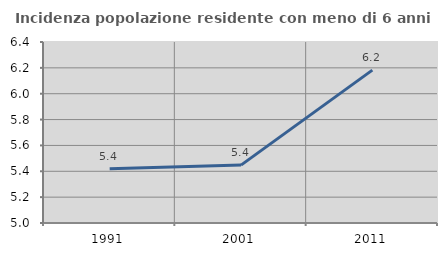
| Category | Incidenza popolazione residente con meno di 6 anni |
|---|---|
| 1991.0 | 5.419 |
| 2001.0 | 5.448 |
| 2011.0 | 6.183 |